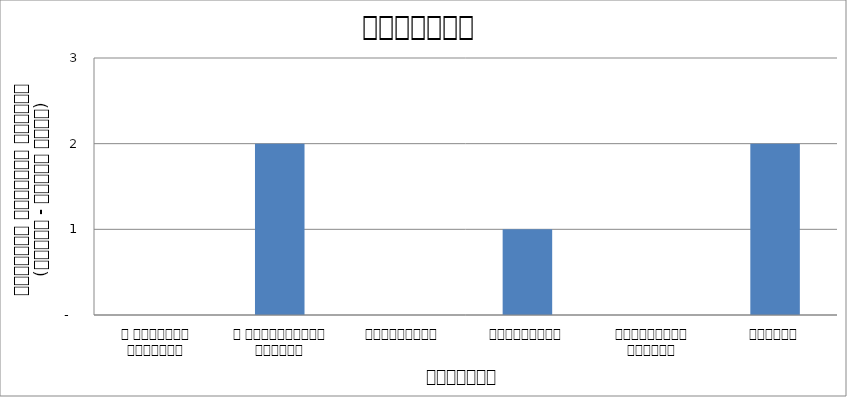
| Category | वातावरण |
|---|---|
| द हिमालयन टाइम्स् | 0 |
| द काठमाण्डौं पोस्ट् | 2 |
| रिपब्लिका | 0 |
| कान्तिपुर | 1 |
| अन्नपूर्ण पोस्ट् | 0 |
| नागरिक | 2 |